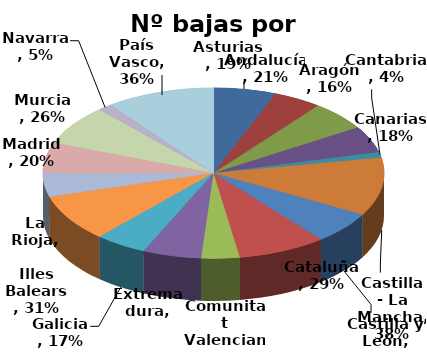
| Category | Nº bajas por enfermedad |
|---|---|
| Andalucía | 0.206 |
| Aragón | 0.159 |
| Asturias | 0.192 |
| Canarias | 0.175 |
| Cantabria | 0.037 |
| Castilla - La Mancha | 0.384 |
| Castilla y León | 0.211 |
| Cataluña | 0.291 |
| Comunitat Valenciana | 0.126 |
| Extremadura | 0.193 |
| Galicia | 0.171 |
| Illes Balears | 0.31 |
| La Rioja | 0.154 |
| Madrid | 0.204 |
| Murcia | 0.262 |
| Navarra | 0.048 |
| País Vasco | 0.358 |